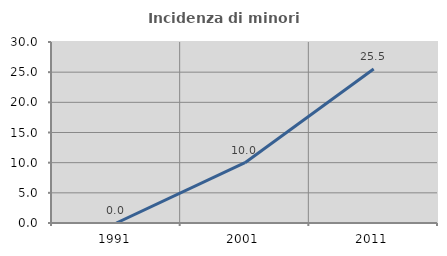
| Category | Incidenza di minori stranieri |
|---|---|
| 1991.0 | 0 |
| 2001.0 | 10 |
| 2011.0 | 25.532 |